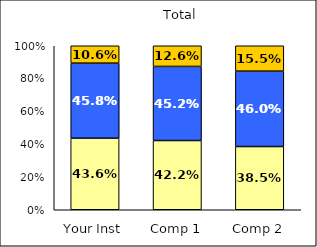
| Category | Low Academic Self-Concept | Average Academic Self-Concept | High Academic Self-Concept |
|---|---|---|---|
| Your Inst | 0.436 | 0.458 | 0.106 |
| Comp 1 | 0.422 | 0.452 | 0.126 |
| Comp 2 | 0.385 | 0.46 | 0.155 |